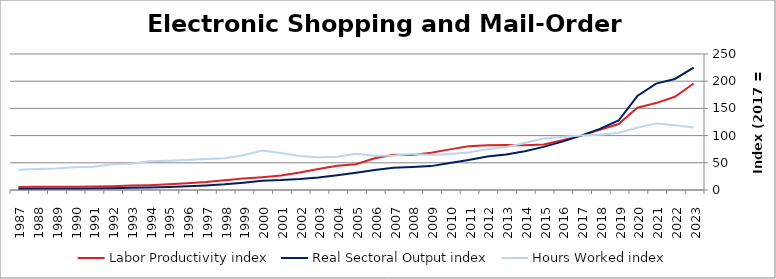
| Category | Labor Productivity index | Real Sectoral Output index | Hours Worked index |
|---|---|---|---|
| 2023.0 | 195.712 | 224.841 | 114.883 |
| 2022.0 | 171.378 | 204.092 | 119.089 |
| 2021.0 | 159.788 | 195.632 | 122.432 |
| 2020.0 | 151.161 | 172.745 | 114.279 |
| 2019.0 | 121.248 | 127.762 | 105.372 |
| 2018.0 | 110.803 | 112.439 | 101.476 |
| 2017.0 | 100 | 100 | 100 |
| 2016.0 | 91.36 | 88.848 | 97.25 |
| 2015.0 | 83.637 | 79.293 | 94.806 |
| 2014.0 | 82.447 | 71.261 | 86.432 |
| 2013.0 | 82.838 | 65.463 | 79.025 |
| 2012.0 | 82.098 | 61.675 | 75.124 |
| 2011.0 | 80.245 | 55.315 | 68.933 |
| 2010.0 | 74.677 | 49.484 | 66.264 |
| 2009.0 | 68.3 | 43.902 | 64.278 |
| 2008.0 | 64.123 | 42.419 | 66.152 |
| 2007.0 | 64.924 | 41.061 | 63.245 |
| 2006.0 | 58.345 | 36.71 | 62.918 |
| 2005.0 | 47.272 | 31.54 | 66.719 |
| 2004.0 | 44.415 | 27.1 | 61.015 |
| 2003.0 | 38.619 | 23.172 | 60.001 |
| 2002.0 | 32.254 | 20.229 | 62.717 |
| 2001.0 | 26.755 | 18.221 | 68.104 |
| 2000.0 | 23.591 | 17.137 | 72.642 |
| 1999.0 | 21.093 | 13.494 | 63.973 |
| 1998.0 | 17.839 | 10.446 | 58.556 |
| 1997.0 | 14.579 | 8.275 | 56.759 |
| 1996.0 | 12.378 | 6.822 | 55.116 |
| 1995.0 | 10.396 | 5.603 | 53.899 |
| 1994.0 | 8.91 | 4.726 | 53.038 |
| 1993.0 | 8.157 | 3.924 | 48.102 |
| 1992.0 | 7.021 | 3.31 | 47.152 |
| 1991.0 | 6.492 | 2.781 | 42.84 |
| 1990.0 | 5.922 | 2.485 | 41.957 |
| 1989.0 | 6.195 | 2.449 | 39.539 |
| 1988.0 | 5.814 | 2.237 | 38.47 |
| 1987.0 | 5.295 | 1.975 | 37.31 |